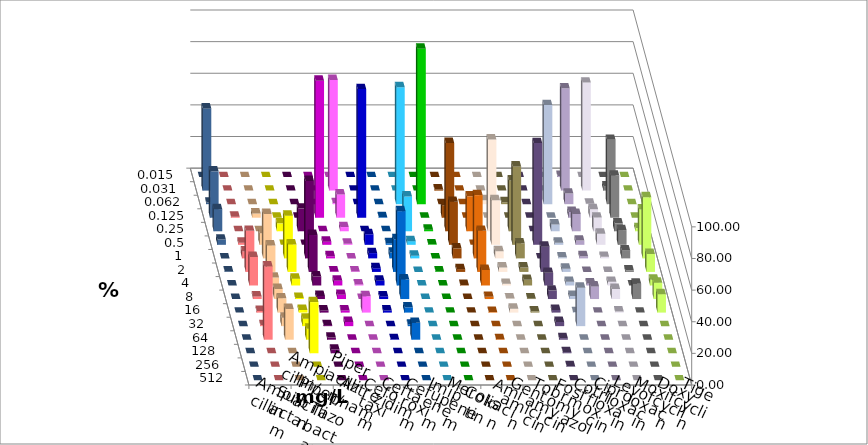
| Category | Ampicillin | Ampicillin/ Sulbactam | Piperacillin | Piperacillin/ Tazobactam | Aztreonam | Cefotaxim | Ceftazidim | Cefuroxim | Imipenem | Meropenem | Colistin | Amikacin | Gentamicin | Tobramycin | Fosfomycin | Cotrimoxazol | Ciprofloxacin | Levofloxacin | Moxifloxacin | Doxycyclin | Tigecyclin |
|---|---|---|---|---|---|---|---|---|---|---|---|---|---|---|---|---|---|---|---|---|---|
| 0.015 | 0 | 0 | 0 | 0 | 0 | 0 | 0 | 0 | 0 | 0 | 0 | 0 | 0 | 0 | 0 | 0 | 0.667 | 0 | 0 | 0 | 0 |
| 0.031 | 0 | 0 | 0 | 0 | 0 | 70 | 0 | 0 | 0 | 0 | 0.707 | 0 | 0 | 0 | 0 | 0 | 64.667 | 68.333 | 2.667 | 0 | 52 |
| 0.062 | 0 | 0 | 0 | 0 | 0 | 0.667 | 0 | 0 | 74 | 98.333 | 0 | 0 | 2.465 | 1.19 | 0 | 62.667 | 6.667 | 0.333 | 40.667 | 0 | 1 |
| 0.125 | 0.667 | 2.676 | 0 | 0 | 86.667 | 14.667 | 81.333 | 0.333 | 0 | 0 | 7.774 | 0 | 0 | 0 | 0 | 0 | 3.667 | 5.333 | 26.667 | 0 | 29.333 |
| 0.25 | 0 | 0 | 5 | 14.333 | 0 | 2.667 | 0 | 0 | 22 | 1 | 55.83 | 22.105 | 58.099 | 32.143 | 0 | 4.333 | 11 | 8.667 | 5 | 2 | 14 |
| 0.5 | 1.333 | 7.358 | 0 | 0 | 2 | 0.667 | 6.667 | 1 | 2.333 | 0.333 | 27.208 | 0 | 28.169 | 49.603 | 64.333 | 1.333 | 2.667 | 7 | 9.333 | 22.333 | 3.333 |
| 1.0 | 4.333 | 28.094 | 27 | 49 | 1.333 | 0 | 3.333 | 3.667 | 1.667 | 0 | 6.36 | 40 | 4.577 | 9.524 | 0 | 0.667 | 1.333 | 1 | 5 | 38.667 | 0 |
| 2.0 | 26 | 16.722 | 17.333 | 23.333 | 0.333 | 0.333 | 2.333 | 20.667 | 0 | 0.333 | 1.767 | 25.965 | 2.817 | 2.778 | 16 | 2 | 0 | 0 | 1 | 11.333 | 0.333 |
| 4.0 | 18 | 5.017 | 4.333 | 5.667 | 3 | 0.667 | 3 | 47 | 0 | 0 | 0.353 | 9.825 | 1.056 | 3.571 | 8 | 2.333 | 1.333 | 2.333 | 0 | 3.667 | 0 |
| 8.0 | 1.667 | 6.355 | 0.667 | 2 | 2.667 | 0 | 1.667 | 12.333 | 0 | 0 | 0 | 1.404 | 0.352 | 0.397 | 5.333 | 2 | 8 | 6.333 | 9.667 | 10.333 | 0 |
| 16.0 | 1 | 9.03 | 1.667 | 1.333 | 1.333 | 10.333 | 1.333 | 3.333 | 0 | 0 | 0 | 0.351 | 2.465 | 0.794 | 1.667 | 0.333 | 0 | 0.667 | 0 | 11.667 | 0 |
| 32.0 | 0.667 | 5.351 | 4.667 | 0.667 | 2.667 | 0 | 0 | 1 | 0 | 0 | 0 | 0 | 0 | 0 | 2.667 | 24.333 | 0 | 0 | 0 | 0 | 0 |
| 64.0 | 46.333 | 19.398 | 7 | 1.333 | 0 | 0 | 0.333 | 10.667 | 0 | 0 | 0 | 0.351 | 0 | 0 | 1 | 0 | 0 | 0 | 0 | 0 | 0 |
| 128.0 | 0 | 0 | 32.333 | 2.333 | 0 | 0 | 0 | 0 | 0 | 0 | 0 | 0 | 0 | 0 | 0.667 | 0 | 0 | 0 | 0 | 0 | 0 |
| 256.0 | 0 | 0 | 0 | 0 | 0 | 0 | 0 | 0 | 0 | 0 | 0 | 0 | 0 | 0 | 0.333 | 0 | 0 | 0 | 0 | 0 | 0 |
| 512.0 | 0 | 0 | 0 | 0 | 0 | 0 | 0 | 0 | 0 | 0 | 0 | 0 | 0 | 0 | 0 | 0 | 0 | 0 | 0 | 0 | 0 |